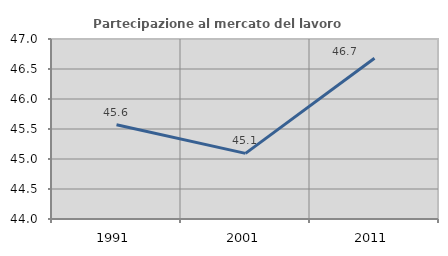
| Category | Partecipazione al mercato del lavoro  femminile |
|---|---|
| 1991.0 | 45.57 |
| 2001.0 | 45.094 |
| 2011.0 | 46.679 |